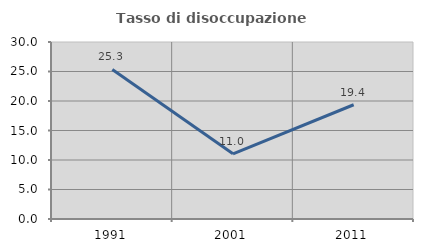
| Category | Tasso di disoccupazione giovanile  |
|---|---|
| 1991.0 | 25.344 |
| 2001.0 | 11.05 |
| 2011.0 | 19.366 |